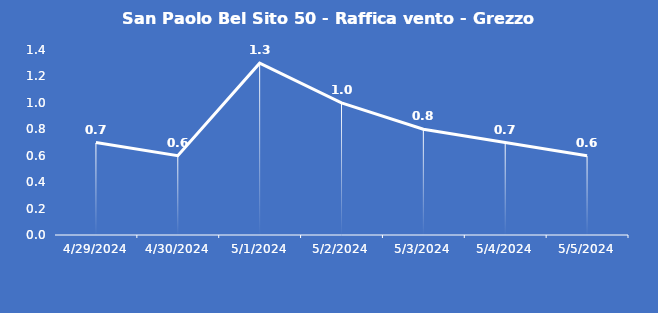
| Category | San Paolo Bel Sito 50 - Raffica vento - Grezzo (m/s) |
|---|---|
| 4/29/24 | 0.7 |
| 4/30/24 | 0.6 |
| 5/1/24 | 1.3 |
| 5/2/24 | 1 |
| 5/3/24 | 0.8 |
| 5/4/24 | 0.7 |
| 5/5/24 | 0.6 |